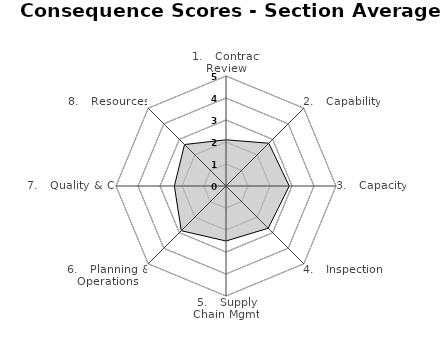
| Category | Series 0 |
|---|---|
| 1.   Contract Review | 2.1 |
| 2.   Capability | 2.75 |
| 3.   Capacity | 2.875 |
| 4.   Inspection  | 2.714 |
| 5.   Supply Chain Mgmt | 2.5 |
| 6.   Planning & Operations | 2.875 |
| 7.   Quality & CI | 2.346 |
| 8.   Resources | 2.667 |